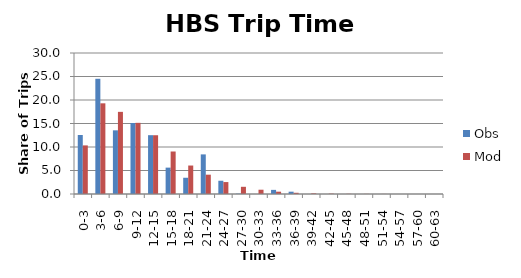
| Category | Obs | Mod |
|---|---|---|
| 0-3 | 12.56 | 10.339 |
| 3-6 | 24.513 | 19.294 |
| 6-9 | 13.547 | 17.477 |
| 9-12 | 15.109 | 15.142 |
| 12-15 | 12.515 | 12.503 |
| 15-18 | 5.611 | 9.042 |
| 18-21 | 3.455 | 6.057 |
| 21-24 | 8.427 | 4.11 |
| 24-27 | 2.819 | 2.538 |
| 27-30 | 0.074 | 1.531 |
| 30-33 | 0 | 0.911 |
| 33-36 | 0.877 | 0.492 |
| 36-39 | 0.493 | 0.259 |
| 39-42 | 0 | 0.135 |
| 42-45 | 0 | 0.08 |
| 45-48 | 0 | 0.04 |
| 48-51 | 0 | 0.025 |
| 51-54 | 0 | 0.016 |
| 54-57 | 0 | 0.005 |
| 57-60 | 0 | 0.003 |
| 60-63 | 0 | 0.001 |